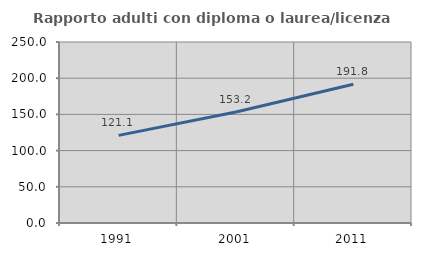
| Category | Rapporto adulti con diploma o laurea/licenza media  |
|---|---|
| 1991.0 | 121.067 |
| 2001.0 | 153.234 |
| 2011.0 | 191.755 |